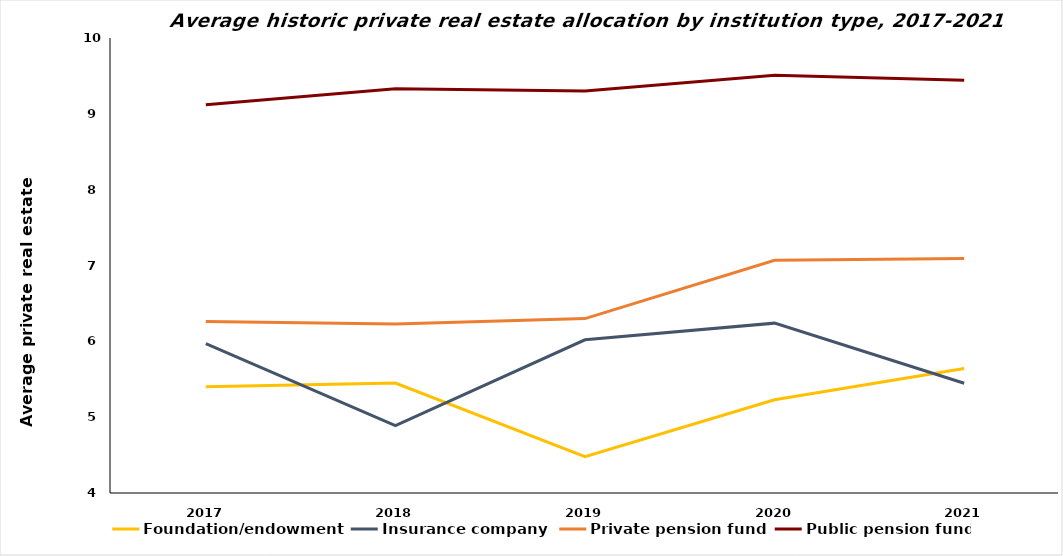
| Category | Foundation/endowment | Insurance company | Private pension fund | Public pension fund |
|---|---|---|---|---|
| 2017.0 | 5.4 | 5.97 | 6.26 | 9.12 |
| 2018.0 | 5.45 | 4.89 | 6.23 | 9.33 |
| 2019.0 | 4.48 | 6.02 | 6.3 | 9.3 |
| 2020.0 | 5.23 | 6.24 | 7.07 | 9.51 |
| 2021.0 | 5.642 | 5.447 | 7.092 | 9.443 |